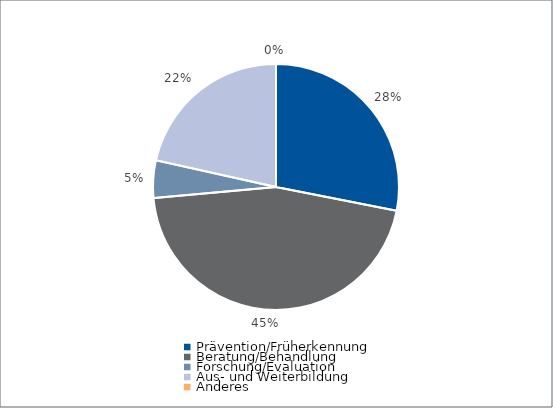
| Category | Series 0 |
|---|---|
| Prävention/Früherkennung | 1720 |
| Beratung/Behandlung | 2785 |
| Forschung/Evaluation | 300.78 |
| Aus- und Weiterbildung | 1318 |
| Anderes | 0 |